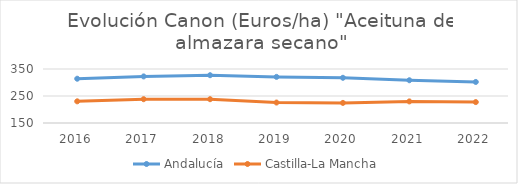
| Category | Andalucía | Castilla-La Mancha |
|---|---|---|
| 2016.0 | 313.993 | 230.27 |
| 2017.0 | 322.515 | 238.151 |
| 2018.0 | 326.993 | 238.151 |
| 2019.0 | 320.821 | 225.774 |
| 2020.0 | 317.448 | 224.433 |
| 2021.0 | 308.347 | 229.966 |
| 2022.0 | 302.041 | 227.45 |